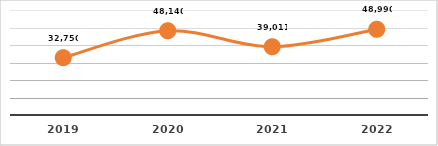
| Category | EVALUACIÓN DE COMPETENCIAS
PRIMER SEMESTRE, EJERCICIO 2023 |
|---|---|
| 2019.0 | 32750 |
| 2020.0 | 48140 |
| 2021.0 | 39011 |
| 2022.0 | 48990 |